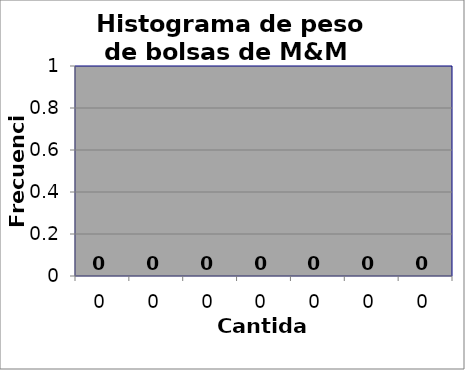
| Category | Series 0 |
|---|---|
| 0.0 | 0 |
| 0.0 | 0 |
| 0.0 | 0 |
| 0.0 | 0 |
| 0.0 | 0 |
| 0.0 | 0 |
| 0.0 | 0 |